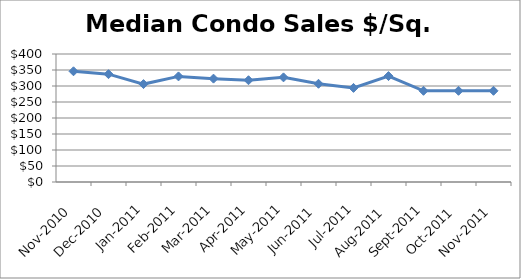
| Category | Series 0 |
|---|---|
| 2010-11-01 | 346 |
| 2010-12-01 | 337 |
| 2011-01-01 | 306 |
| 2011-02-01 | 330 |
| 2011-03-01 | 323 |
| 2011-04-01 | 318 |
| 2011-05-01 | 327 |
| 2011-06-01 | 307 |
| 2011-07-01 | 294 |
| 2011-08-01 | 331 |
| 2011-09-01 | 285 |
| 2011-10-01 | 285 |
| 2011-11-01 | 285 |